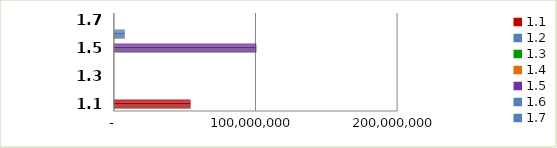
| Category | Series 0 |
|---|---|
| 1.1 | 54184108.201 |
| 1.2 | 0 |
| 1.3 | 0 |
| 1.4 | 0 |
| 1.5 | 100647033.239 |
| 1.6 | 7690389 |
| 1.7 | 0 |